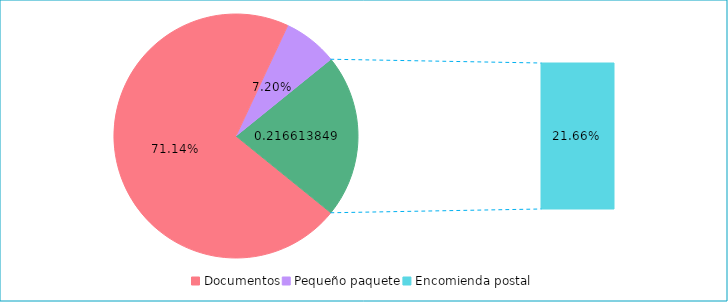
| Category | Series 0 |
|---|---|
| Documentos | 0.711 |
| Pequeño paquete | 0.072 |
| Encomienda postal | 0.217 |